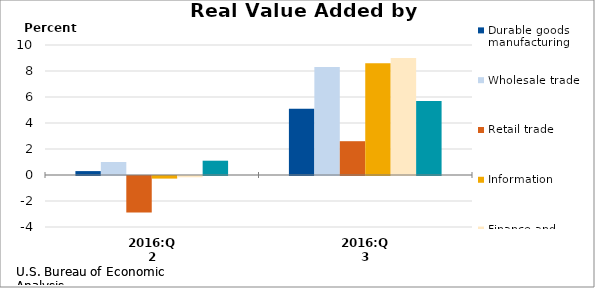
| Category | Durable goods manufacturing | Wholesale trade | Retail trade | Information | Finance and insurance | Administrative and waste management services |
|---|---|---|---|---|---|---|
| 2016:Q2 | 0.3 | 1 | -2.8 | -0.2 | -0.1 | 1.1 |
| 2016:Q3 | 5.1 | 8.3 | 2.6 | 8.6 | 9 | 5.7 |